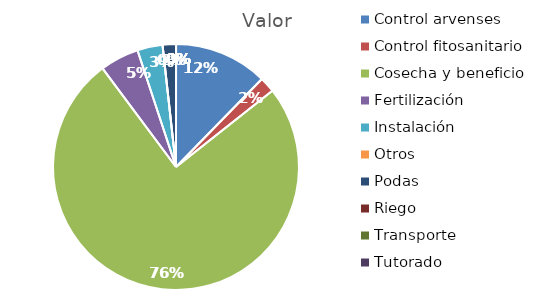
| Category | Valor |
|---|---|
| Control arvenses | 9790861 |
| Control fitosanitario | 1626968 |
| Cosecha y beneficio | 60071166 |
| Fertilización | 4067420 |
| Instalación | 2643823 |
| Otros | 0 |
| Podas | 1394544 |
| Riego | 0 |
| Transporte | 0 |
| Tutorado | 0 |